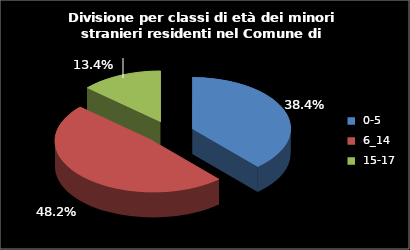
| Category | Series 0 |
|---|---|
| 0-5 | 152 |
| 6_14 | 191 |
| 15-17 | 53 |